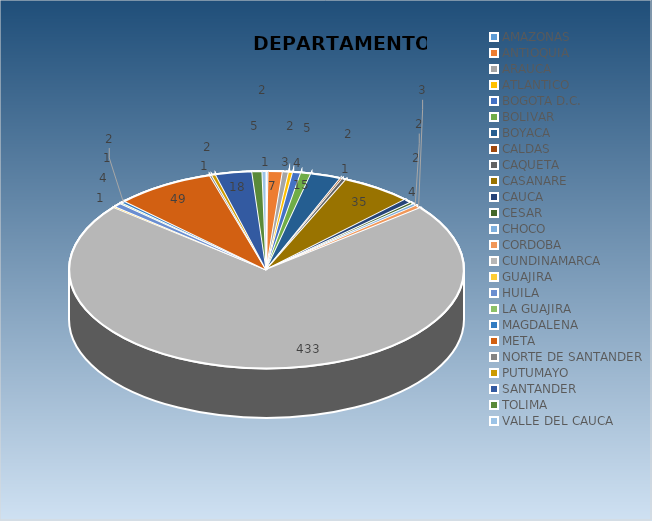
| Category | Total |
|---|---|
| AMAZONAS | 1 |
| ANTIOQUIA | 7 |
| ARAUCA | 3 |
| ATLANTICO | 2 |
| BOGOTA D.C. | 4 |
| BOLIVAR | 5 |
| BOYACA | 15 |
| CALDAS | 1 |
| CAQUETA | 2 |
| CASANARE | 35 |
| CAUCA | 4 |
| CESAR | 2 |
| CHOCO | 2 |
| CORDOBA | 3 |
| CUNDINAMARCA | 433 |
| GUAJIRA | 1 |
| HUILA | 4 |
| LA GUAJIRA | 1 |
| MAGDALENA | 2 |
| META | 49 |
| NORTE DE SANTANDER | 1 |
| PUTUMAYO | 2 |
| SANTANDER | 18 |
| TOLIMA | 5 |
| VALLE DEL CAUCA | 2 |